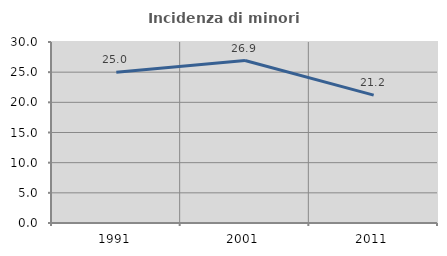
| Category | Incidenza di minori stranieri |
|---|---|
| 1991.0 | 25 |
| 2001.0 | 26.923 |
| 2011.0 | 21.188 |